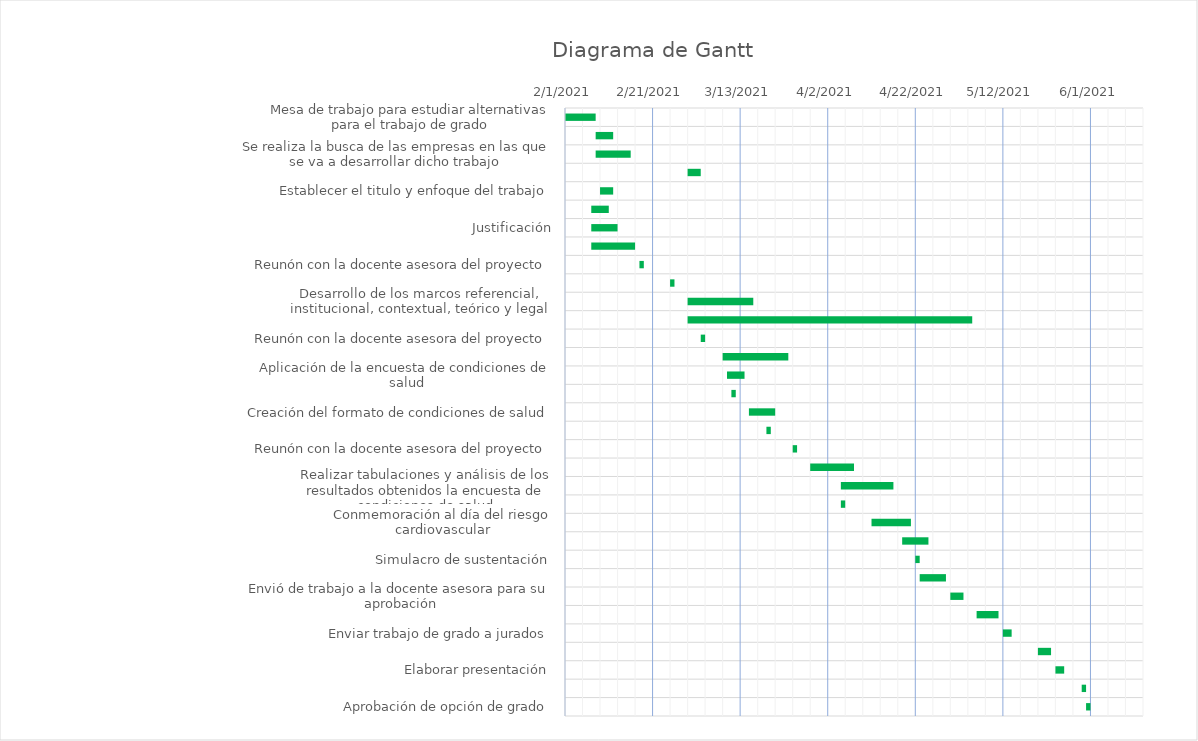
| Category | Series 0 | Series 1 |
|---|---|---|
| Mesa de trabajo para estudiar alternativas para el trabajo de grado | 2/1/21 | 7 |
| Se define el trabajo de grado | 2/8/21 | 4 |
| Se realiza la busca de las empresas en las que se va a desarrollar dicho trabajo | 2/8/21 | 8 |
| Se establece relación con empresas en las que se desarrollara acabo el trabajo | 3/1/21 | 3 |
| Establecer el titulo y enfoque del trabajo | 2/9/21 | 3 |
| Planteamiento del problema | 2/7/21 | 4 |
| Justificación | 2/7/21 | 6 |
| Definir y establecer los objetivos del presente trabajo | 2/7/21 | 10 |
| Reunón con la docente asesora del proyecto | 2/18/21 | 1 |
| Reunón con la docente asesora del proyecto | 2/25/21 | 1 |
| Desarrollo de los marcos referencial, institucional, contextual, teórico y legal | 3/1/21 | 15 |
| Desarrollo de referencias | 3/1/21 | 65 |
| Reunón con la docente asesora del proyecto | 3/4/21 | 1 |
| Sensibilización con  los trabajadores en cuanto al riesgo cardiovascular | 3/9/21 | 15 |
| Aplicación de la encuesta de condiciones de salud | 3/10/21 | 4 |
| Reunón con la docente asesora del proyecto | 3/11/21 | 1 |
| Creación del formato de condiciones de salud | 3/15/21 | 6 |
| Reunón con la docente asesora del proyecto | 3/19/21 | 1 |
| Reunón con la docente asesora del proyecto | 3/25/21 | 1 |
| Definir la metodología que será utilizada para el trabajo | 3/29/21 | 10 |
| Realizar tabulaciones y análisis de los resultados obtenidos la encuesta de condiciones de salud | 4/5/21 | 12 |
| Reunón con la docente asesora del proyecto | 4/5/21 | 1 |
| Conmemoración al día del riesgo cardiovascular | 4/12/21 | 9 |
| Definir las conclusiones obtenidas del programa | 4/19/21 | 6 |
| Simulacro de sustentación | 4/22/21 | 1 |
| Realizar correcciones pertinentes | 4/23/21 | 6 |
| Envió de trabajo a la docente asesora para su aprobación | 4/30/21 | 3 |
| Realizar correcciones pertinentes | 5/6/21 | 5 |
| Enviar trabajo de grado a jurados | 5/12/21 | 2 |
| Realizar correcciones pertinentes | 5/20/21 | 3 |
| Elaborar presentación | 5/24/21 | 2 |
| Sustentación de Trabajo de grao | 5/30/21 | 1 |
| Aprobación de opción de grado | 5/31/21 | 1 |